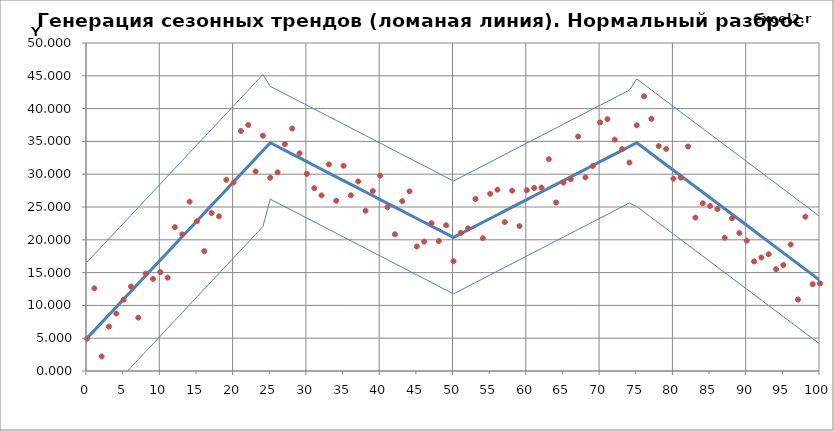
| Category | Тренд (Y) | С разбросом вокруг тренда (Y) | Нижняя граница | Верхняя граница |
|---|---|---|---|---|
| 0.0 | 5 | 4.917 | -6.588 | 16.588 |
| 1.0 | 6.192 | 12.608 | -5.396 | 17.78 |
| 2.0 | 7.384 | 2.22 | -4.204 | 18.971 |
| 3.0 | 8.575 | 6.772 | -3.012 | 20.163 |
| 4.0 | 9.767 | 8.762 | -1.821 | 21.355 |
| 5.0 | 10.959 | 10.879 | -0.629 | 22.547 |
| 6.0 | 12.151 | 12.877 | 0.563 | 23.738 |
| 7.0 | 13.342 | 8.14 | 1.755 | 24.93 |
| 8.0 | 14.534 | 14.843 | 2.946 | 26.122 |
| 9.0 | 15.726 | 14.034 | 4.138 | 27.314 |
| 10.0 | 16.918 | 15.063 | 5.33 | 28.505 |
| 11.0 | 18.109 | 14.23 | 6.522 | 29.697 |
| 12.0 | 19.301 | 21.922 | 7.713 | 30.889 |
| 13.0 | 20.493 | 20.828 | 8.905 | 32.081 |
| 14.0 | 21.685 | 25.81 | 10.097 | 33.272 |
| 15.0 | 22.876 | 22.835 | 11.289 | 34.464 |
| 16.0 | 24.068 | 18.27 | 12.48 | 35.656 |
| 17.0 | 25.26 | 24.077 | 13.672 | 36.848 |
| 18.0 | 26.452 | 23.58 | 14.864 | 38.039 |
| 19.0 | 27.643 | 29.146 | 16.056 | 39.231 |
| 20.0 | 28.835 | 28.734 | 17.247 | 40.423 |
| 21.0 | 30.027 | 36.581 | 18.439 | 41.615 |
| 22.0 | 31.219 | 37.511 | 19.631 | 42.806 |
| 23.0 | 32.41 | 30.416 | 20.823 | 43.998 |
| 24.0 | 33.602 | 35.876 | 22.014 | 45.19 |
| 25.0 | 34.794 | 29.455 | 26.193 | 43.395 |
| 26.0 | 34.216 | 30.284 | 25.616 | 42.817 |
| 27.0 | 33.639 | 34.585 | 25.038 | 42.24 |
| 28.0 | 33.062 | 36.975 | 24.461 | 41.663 |
| 29.0 | 32.484 | 33.18 | 23.884 | 41.085 |
| 30.0 | 31.907 | 30.051 | 23.306 | 40.508 |
| 31.0 | 31.33 | 27.863 | 22.729 | 39.93 |
| 32.0 | 30.752 | 26.773 | 22.152 | 39.353 |
| 33.0 | 30.175 | 31.497 | 21.574 | 38.776 |
| 34.0 | 29.598 | 25.956 | 20.997 | 38.198 |
| 35.0 | 29.02 | 31.292 | 20.42 | 37.621 |
| 36.0 | 28.443 | 26.779 | 19.842 | 37.044 |
| 37.0 | 27.866 | 28.895 | 19.265 | 36.466 |
| 38.0 | 27.288 | 24.432 | 18.688 | 35.889 |
| 39.0 | 26.711 | 27.433 | 18.11 | 35.312 |
| 40.0 | 26.134 | 29.771 | 17.533 | 34.734 |
| 41.0 | 25.556 | 24.959 | 16.955 | 34.157 |
| 42.0 | 24.979 | 20.848 | 16.378 | 33.58 |
| 43.0 | 24.402 | 25.888 | 15.801 | 33.002 |
| 44.0 | 23.824 | 27.385 | 15.223 | 32.425 |
| 45.0 | 23.247 | 18.982 | 14.646 | 31.848 |
| 46.0 | 22.669 | 19.725 | 14.069 | 31.27 |
| 47.0 | 22.092 | 22.528 | 13.491 | 30.693 |
| 48.0 | 21.515 | 19.812 | 12.914 | 30.116 |
| 49.0 | 20.937 | 22.221 | 12.337 | 29.538 |
| 50.0 | 20.36 | 16.74 | 11.759 | 28.961 |
| 51.0 | 20.937 | 21.054 | 12.337 | 29.538 |
| 52.0 | 21.515 | 21.74 | 12.914 | 30.116 |
| 53.0 | 22.092 | 26.231 | 13.491 | 30.693 |
| 54.0 | 22.669 | 20.241 | 14.069 | 31.27 |
| 55.0 | 23.247 | 27.011 | 14.646 | 31.848 |
| 56.0 | 23.824 | 27.641 | 15.223 | 32.425 |
| 57.0 | 24.402 | 22.706 | 15.801 | 33.002 |
| 58.0 | 24.979 | 27.484 | 16.378 | 33.58 |
| 59.0 | 25.556 | 22.088 | 16.955 | 34.157 |
| 60.0 | 26.134 | 27.557 | 17.533 | 34.734 |
| 61.0 | 26.711 | 27.906 | 18.11 | 35.312 |
| 62.0 | 27.288 | 27.969 | 18.688 | 35.889 |
| 63.0 | 27.866 | 32.3 | 19.265 | 36.466 |
| 64.0 | 28.443 | 25.677 | 19.842 | 37.044 |
| 65.0 | 29.02 | 28.713 | 20.42 | 37.621 |
| 66.0 | 29.598 | 29.228 | 20.997 | 38.198 |
| 67.0 | 30.175 | 35.743 | 21.574 | 38.776 |
| 68.0 | 30.752 | 29.513 | 22.152 | 39.353 |
| 69.0 | 31.33 | 31.237 | 22.729 | 39.93 |
| 70.0 | 31.907 | 37.891 | 23.306 | 40.508 |
| 71.0 | 32.484 | 38.384 | 23.884 | 41.085 |
| 72.0 | 33.062 | 35.266 | 24.461 | 41.663 |
| 73.0 | 33.639 | 33.831 | 25.038 | 42.24 |
| 74.0 | 34.216 | 31.776 | 25.616 | 42.817 |
| 75.0 | 34.794 | 37.459 | 25.071 | 44.517 |
| 76.0 | 33.955 | 41.873 | 24.231 | 43.678 |
| 77.0 | 33.116 | 38.442 | 23.392 | 42.839 |
| 78.0 | 32.277 | 34.291 | 22.553 | 42 |
| 79.0 | 31.437 | 33.844 | 21.714 | 41.161 |
| 80.0 | 30.598 | 29.319 | 20.875 | 40.322 |
| 81.0 | 29.759 | 29.477 | 20.036 | 39.483 |
| 82.0 | 28.92 | 34.218 | 19.197 | 38.643 |
| 83.0 | 28.081 | 23.378 | 18.358 | 37.804 |
| 84.0 | 27.242 | 25.566 | 17.519 | 36.965 |
| 85.0 | 26.403 | 25.145 | 16.68 | 36.126 |
| 86.0 | 25.564 | 24.695 | 15.84 | 35.287 |
| 87.0 | 24.725 | 20.302 | 15.001 | 34.448 |
| 88.0 | 23.886 | 23.298 | 14.162 | 33.609 |
| 89.0 | 23.046 | 21.022 | 13.323 | 32.77 |
| 90.0 | 22.207 | 19.861 | 12.484 | 31.931 |
| 91.0 | 21.368 | 16.702 | 11.645 | 31.092 |
| 92.0 | 20.529 | 17.304 | 10.806 | 30.252 |
| 93.0 | 19.69 | 17.796 | 9.967 | 29.413 |
| 94.0 | 18.851 | 15.527 | 9.128 | 28.574 |
| 95.0 | 18.012 | 16.144 | 8.289 | 27.735 |
| 96.0 | 17.173 | 19.279 | 7.449 | 26.896 |
| 97.0 | 16.334 | 10.894 | 6.61 | 26.057 |
| 98.0 | 15.495 | 23.517 | 5.771 | 25.218 |
| 99.0 | 14.655 | 13.221 | 4.932 | 24.379 |
| 100.0 | 13.816 | 13.346 | 4.093 | 23.54 |